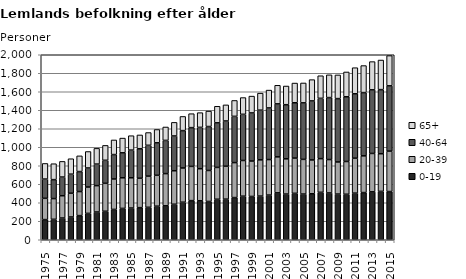
| Category | 0-19 | 20-39 | 40-64 | 65+ |
|---|---|---|---|---|
| 1975.0 | 218 | 230 | 208 | 169 |
| 1976.0 | 221 | 224 | 205 | 172 |
| 1977.0 | 235 | 241 | 202 | 169 |
| 1978.0 | 246 | 257 | 206 | 167 |
| 1979.0 | 261 | 260 | 216 | 170 |
| 1980.0 | 285 | 285 | 206 | 178 |
| 1981.0 | 300 | 285 | 233 | 170 |
| 1982.0 | 308 | 302 | 249 | 161 |
| 1983.0 | 328 | 329 | 264 | 158 |
| 1984.0 | 339 | 331 | 270 | 159 |
| 1985.0 | 343 | 327 | 299 | 156 |
| 1986.0 | 347 | 318 | 319 | 149 |
| 1987.0 | 351 | 337 | 333 | 138 |
| 1988.0 | 363 | 334 | 351 | 144 |
| 1989.0 | 367 | 348 | 359 | 145 |
| 1990.0 | 384 | 362 | 376 | 147 |
| 1991.0 | 406 | 370 | 404 | 153 |
| 1992.0 | 423 | 370 | 419 | 151 |
| 1993.0 | 421 | 347 | 447 | 159 |
| 1994.0 | 414 | 335 | 475 | 167 |
| 1995.0 | 438 | 344 | 482 | 179 |
| 1996.0 | 439 | 356 | 489 | 174 |
| 1997.0 | 456 | 378 | 500 | 172 |
| 1998.0 | 471 | 386 | 499 | 181 |
| 1999.0 | 468 | 383 | 520 | 182 |
| 2000.0 | 472 | 392 | 537 | 184 |
| 2001.0 | 483 | 384 | 558 | 193 |
| 2002.0 | 507 | 389 | 573 | 201 |
| 2003.0 | 494 | 381 | 585 | 202 |
| 2004.0 | 502 | 381 | 598 | 213 |
| 2005.0 | 494 | 375 | 611 | 215 |
| 2006.0 | 497 | 366 | 638 | 230 |
| 2007.0 | 513 | 364 | 652 | 244 |
| 2008.0 | 506 | 361 | 670 | 246 |
| 2009.0 | 494 | 347 | 685 | 256 |
| 2010.0 | 492 | 354 | 700 | 268 |
| 2011.0 | 504 | 378 | 696 | 282 |
| 2012.0 | 510 | 397 | 684 | 292 |
| 2013.0 | 518 | 415 | 688 | 305 |
| 2014.0 | 523 | 407 | 693 | 320 |
| 2015.0 | 521 | 437 | 706 | 327 |